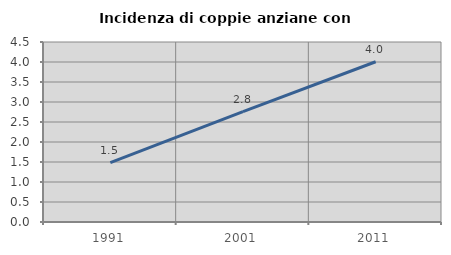
| Category | Incidenza di coppie anziane con figli |
|---|---|
| 1991.0 | 1.483 |
| 2001.0 | 2.758 |
| 2011.0 | 4.006 |